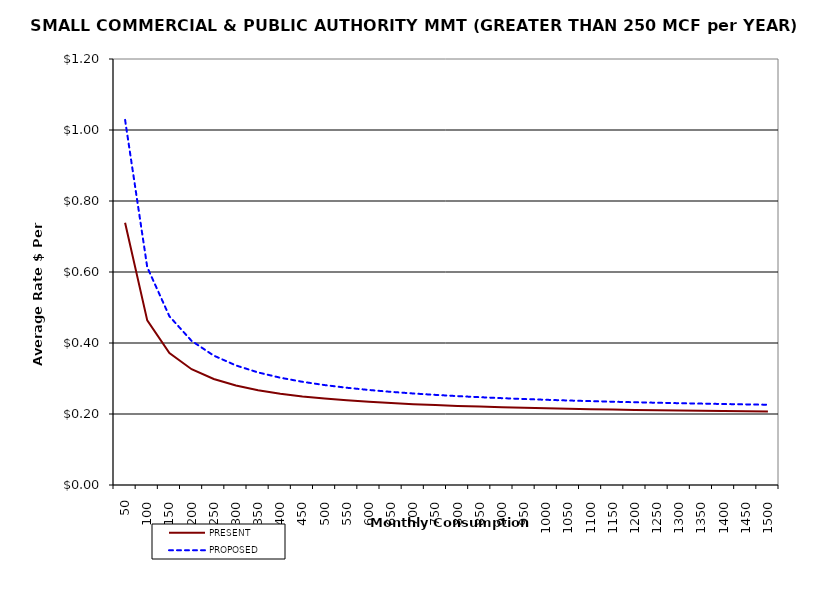
| Category | PRESENT | PROPOSED |
|---|---|---|
| 50.0 | 0.739 | 1.029 |
| 100.0 | 0.464 | 0.614 |
| 150.0 | 0.372 | 0.475 |
| 200.0 | 0.326 | 0.406 |
| 250.0 | 0.299 | 0.365 |
| 300.0 | 0.28 | 0.337 |
| 350.0 | 0.267 | 0.317 |
| 400.0 | 0.257 | 0.302 |
| 450.0 | 0.25 | 0.291 |
| 500.0 | 0.244 | 0.282 |
| 550.0 | 0.239 | 0.274 |
| 600.0 | 0.234 | 0.268 |
| 650.0 | 0.231 | 0.262 |
| 700.0 | 0.228 | 0.258 |
| 750.0 | 0.225 | 0.254 |
| 800.0 | 0.223 | 0.25 |
| 850.0 | 0.221 | 0.247 |
| 900.0 | 0.219 | 0.245 |
| 950.0 | 0.217 | 0.242 |
| 1000.0 | 0.216 | 0.24 |
| 1050.0 | 0.215 | 0.238 |
| 1100.0 | 0.213 | 0.236 |
| 1150.0 | 0.212 | 0.235 |
| 1200.0 | 0.211 | 0.233 |
| 1250.0 | 0.21 | 0.232 |
| 1300.0 | 0.21 | 0.23 |
| 1350.0 | 0.209 | 0.229 |
| 1400.0 | 0.208 | 0.228 |
| 1450.0 | 0.207 | 0.227 |
| 1500.0 | 0.207 | 0.226 |